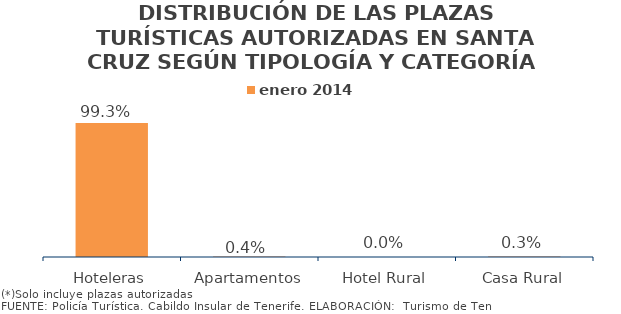
| Category | enero 2014 |
|---|---|
| Hoteleras | 0.993 |
| Apartamentos | 0.004 |
| Hotel Rural | 0 |
| Casa Rural | 0.003 |